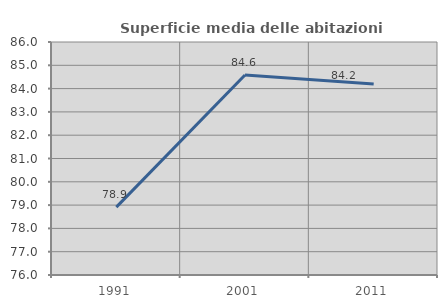
| Category | Superficie media delle abitazioni occupate |
|---|---|
| 1991.0 | 78.915 |
| 2001.0 | 84.582 |
| 2011.0 | 84.2 |